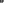
| Category | 'sun-3851'!#REF! |
|---|---|
| 0 | 1 |